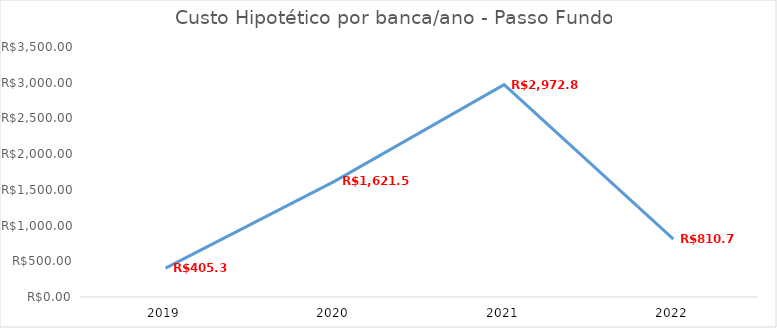
| Category | Series 0 |
|---|---|
| 2019.0 | 405.39 |
| 2020.0 | 1621.56 |
| 2021.0 | 2972.86 |
| 2022.0 | 810.78 |